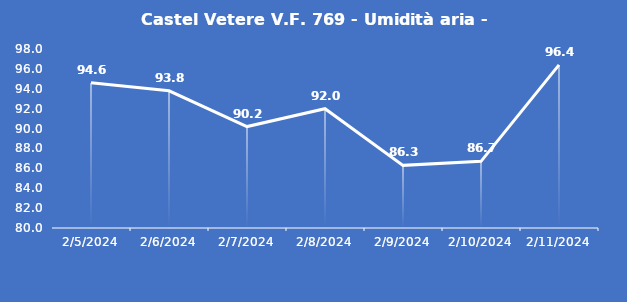
| Category | Castel Vetere V.F. 769 - Umidità aria - Grezzo (%) |
|---|---|
| 2/5/24 | 94.6 |
| 2/6/24 | 93.8 |
| 2/7/24 | 90.2 |
| 2/8/24 | 92 |
| 2/9/24 | 86.3 |
| 2/10/24 | 86.7 |
| 2/11/24 | 96.4 |